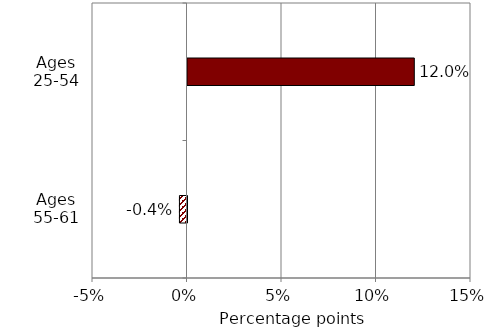
| Category | Series 0 |
|---|---|
| Ages 55-61 | -0.004 |
| Ages 25-54 | 0.12 |